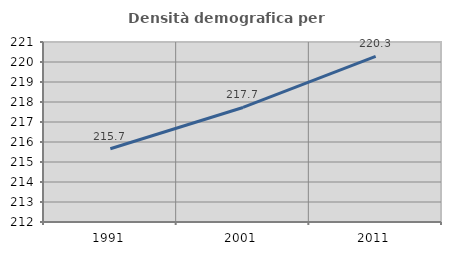
| Category | Densità demografica |
|---|---|
| 1991.0 | 215.665 |
| 2001.0 | 217.726 |
| 2011.0 | 220.279 |